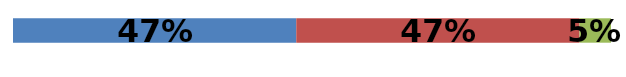
| Category | Series 0 | Series 1 | Series 2 |
|---|---|---|---|
| 0 | 0.474 | 0.474 | 0.053 |